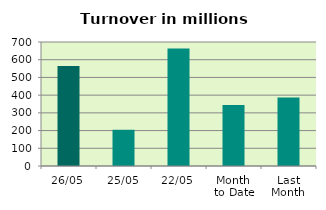
| Category | Series 0 |
|---|---|
| 26/05 | 564.676 |
| 25/05 | 204.551 |
| 22/05 | 663.268 |
| Month 
to Date | 343.752 |
| Last
Month | 387.046 |